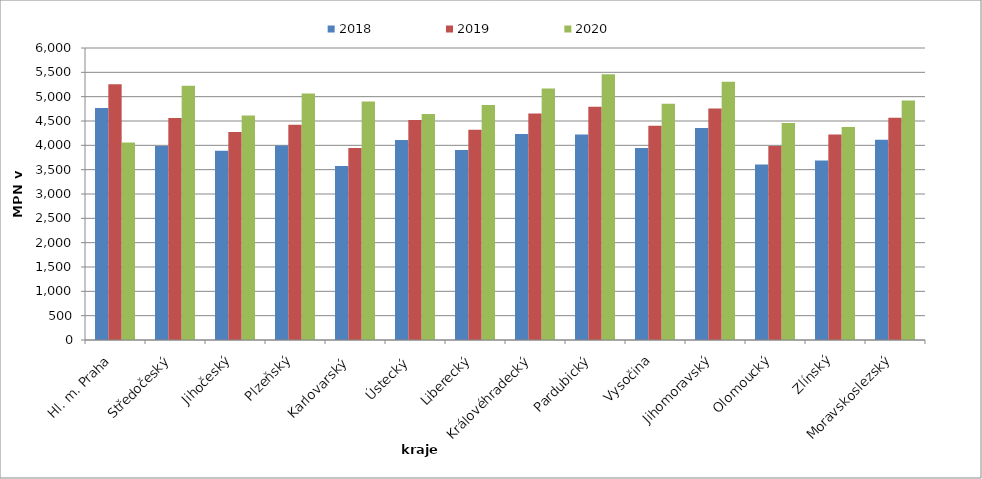
| Category | 2018 | 2019 | 2020 |
|---|---|---|---|
| Hl. m. Praha | 4768 | 5256 | 4057 |
| Středočeský | 3986 | 4562 | 5226 |
| Jihočeský | 3887 | 4276 | 4611 |
| Plzeňský | 3998 | 4425 | 5063 |
| Karlovarský  | 3577 | 3945 | 4899 |
| Ústecký   | 4109 | 4520 | 4645 |
| Liberecký | 3904 | 4318 | 4827 |
| Královéhradecký | 4232 | 4655 | 5167 |
| Pardubický | 4221 | 4792 | 5463 |
| Vysočina | 3947 | 4401 | 4855 |
| Jihomoravský | 4356 | 4757 | 5305 |
| Olomoucký | 3608 | 3987 | 4458 |
| Zlínský | 3688 | 4221 | 4377 |
| Moravskoslezský | 4113 | 4566 | 4919 |